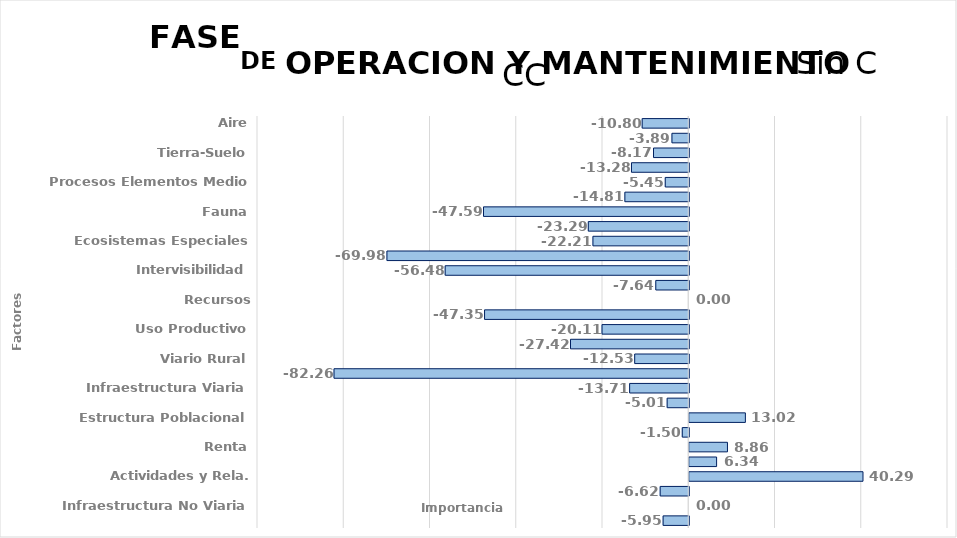
| Category | Series 0 |
|---|---|
| Aire | -10.799 |
| Clima Condiciones Climaticas | -3.891 |
| Tierra-Suelo | -8.172 |
| Aguas Continentales | -13.28 |
| Procesos Elementos Medio | -5.448 |
| Vegetación o Flora | -14.81 |
| Fauna | -47.593 |
| Procesos del Medio Biótico | -23.29 |
| Ecosistemas Especiales | -22.214 |
| Paisaje Intrínseco | -69.985 |
| Intervisibilidad | -56.48 |
| Componentes Singulares Paisaje | -7.644 |
| Recursos Científico-Culturales | 0 |
| Uso Recreativo al Aire Libre | -47.351 |
| Uso Productivo | -20.107 |
| Conservación de la Naturaleza | -27.418 |
| Viario Rural | -12.534 |
| Características Culturales | -82.255 |
| Infraestructura Viaria | -13.709 |
| Dinámica Poblacional | -5.007 |
| Estructura Poblacional | 13.017 |
| Densidad de Población | -1.502 |
| Renta | 8.86 |
| Finanzas y Sector Público | 6.342 |
| Actividades y Rela. Económicas | 40.288 |
| Infraestructura Viaria | -6.625 |
| Infraestructura No Viaria | 0 |
| Equipamiento y Servicios | -5.945 |